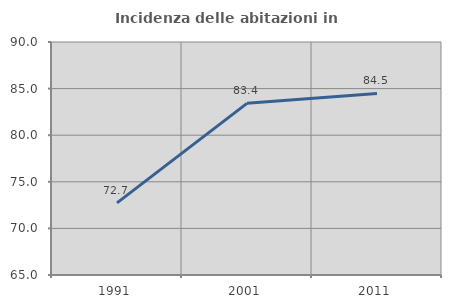
| Category | Incidenza delle abitazioni in proprietà  |
|---|---|
| 1991.0 | 72.742 |
| 2001.0 | 83.415 |
| 2011.0 | 84.483 |